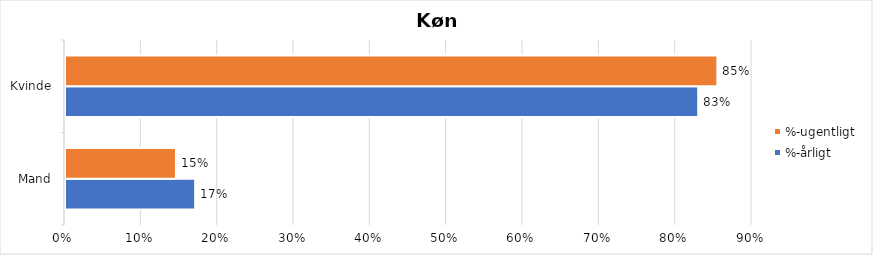
| Category | %-årligt | %-ugentligt |
|---|---|---|
| Mand | 0.17 | 0.145 |
| Kvinde | 0.83 | 0.855 |